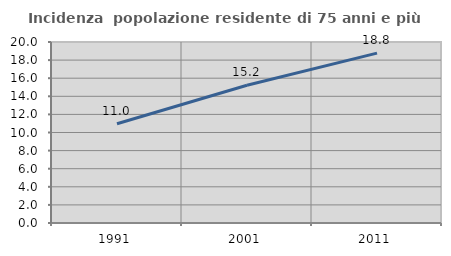
| Category | Incidenza  popolazione residente di 75 anni e più |
|---|---|
| 1991.0 | 10.968 |
| 2001.0 | 15.225 |
| 2011.0 | 18.773 |